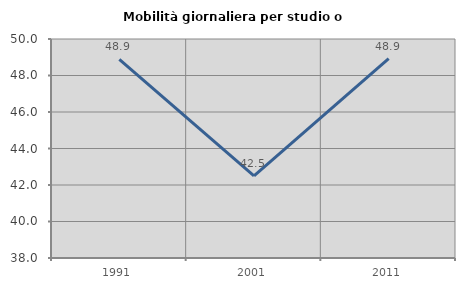
| Category | Mobilità giornaliera per studio o lavoro |
|---|---|
| 1991.0 | 48.887 |
| 2001.0 | 42.494 |
| 2011.0 | 48.93 |